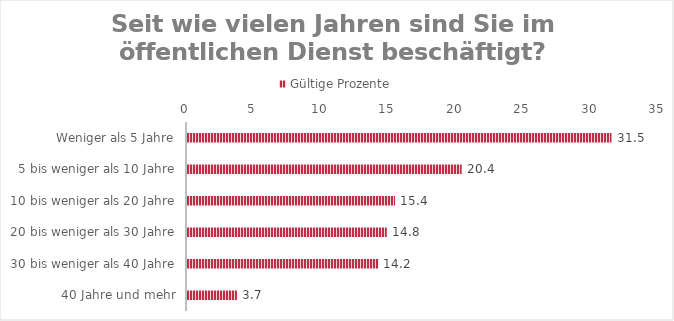
| Category | Gültige Prozente |
|---|---|
| Weniger als 5 Jahre | 31.481 |
| 5 bis weniger als 10 Jahre | 20.37 |
| 10 bis weniger als 20 Jahre | 15.432 |
| 20 bis weniger als 30 Jahre | 14.815 |
| 30 bis weniger als 40 Jahre | 14.198 |
| 40 Jahre und mehr | 3.704 |